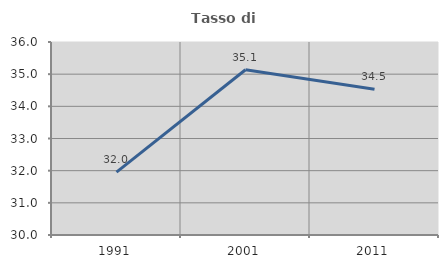
| Category | Tasso di occupazione   |
|---|---|
| 1991.0 | 31.955 |
| 2001.0 | 35.137 |
| 2011.0 | 34.533 |